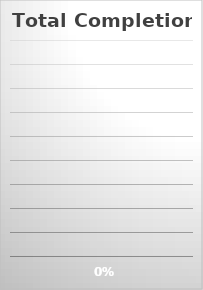
| Category | Total Percentage Complete: |
|---|---|
| 0 | 0 |